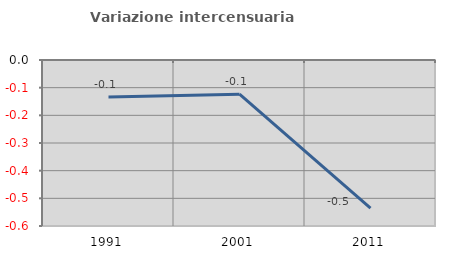
| Category | Variazione intercensuaria annua |
|---|---|
| 1991.0 | -0.134 |
| 2001.0 | -0.124 |
| 2011.0 | -0.535 |